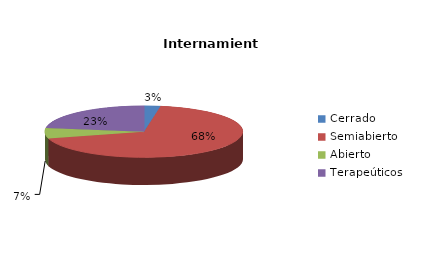
| Category | Series 0 |
|---|---|
| Cerrado | 2 |
| Semiabierto | 51 |
| Abierto | 5 |
| Terapeúticos | 17 |